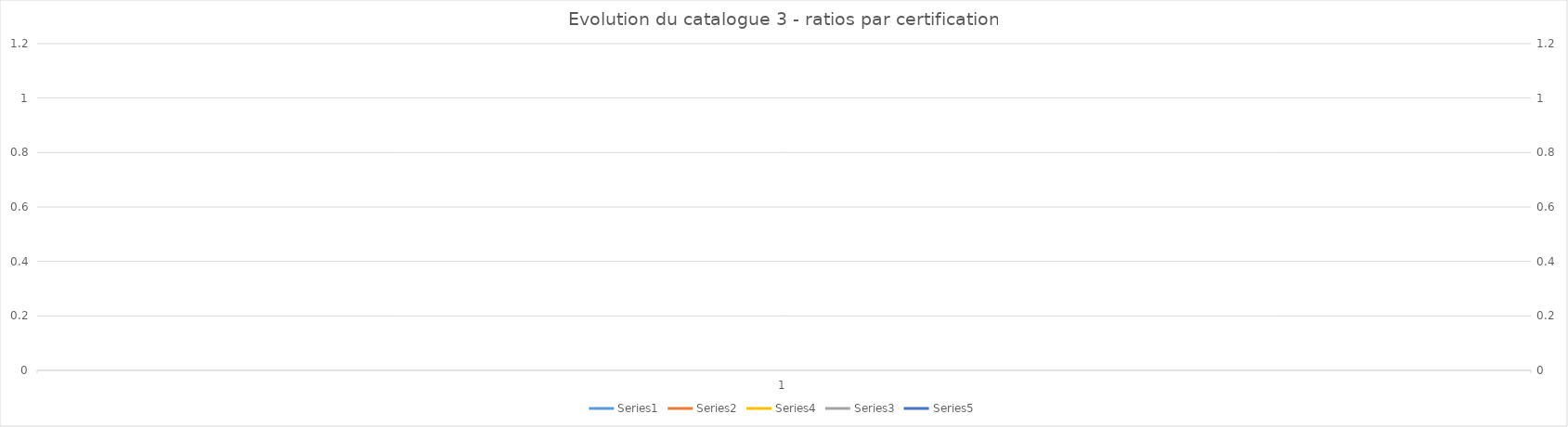
| Category | Series 0 | Series 1 | Series 3 |
|---|---|---|---|
| 0 | 1 | 1 | 1 |